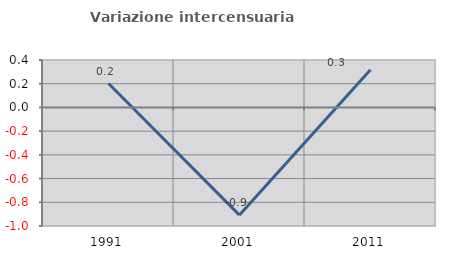
| Category | Variazione intercensuaria annua |
|---|---|
| 1991.0 | 0.202 |
| 2001.0 | -0.908 |
| 2011.0 | 0.318 |